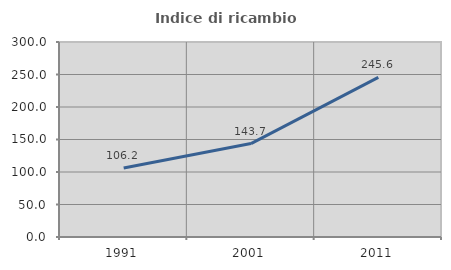
| Category | Indice di ricambio occupazionale  |
|---|---|
| 1991.0 | 106.186 |
| 2001.0 | 143.729 |
| 2011.0 | 245.635 |